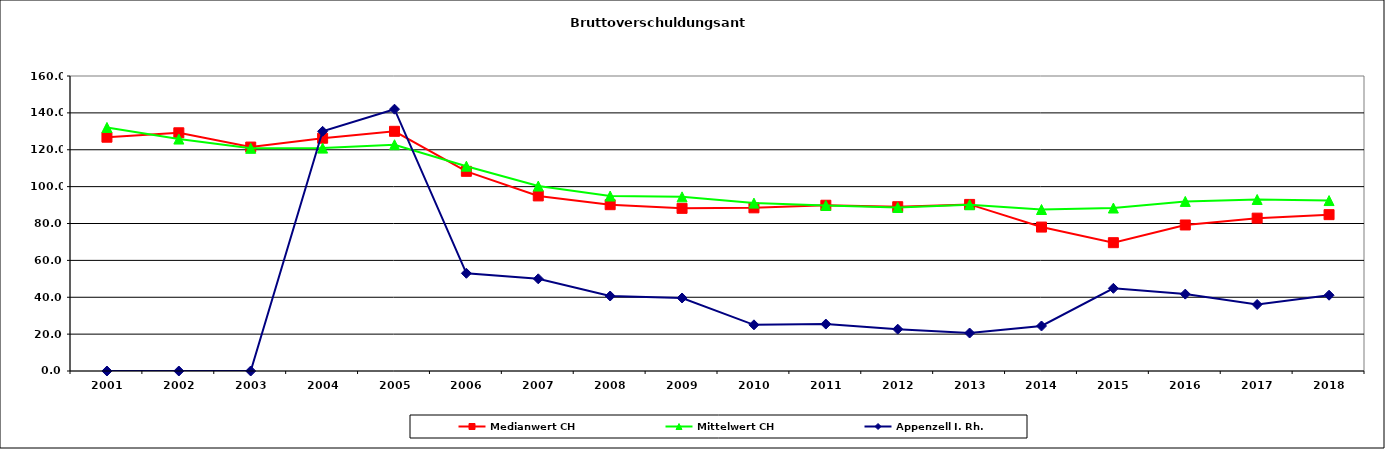
| Category | Medianwert CH | Mittelwert CH | Appenzell I. Rh. |
|---|---|---|---|
| 2001.0 | 126.8 | 132.1 | 0 |
| 2002.0 | 129.2 | 125.8 | 0 |
| 2003.0 | 121.45 | 120.775 | 0 |
| 2004.0 | 126.25 | 120.889 | 130 |
| 2005.0 | 130 | 122.728 | 142 |
| 2006.0 | 108.3 | 111.087 | 53 |
| 2007.0 | 94.96 | 100.307 | 50 |
| 2008.0 | 90.2 | 94.911 | 40.67 |
| 2009.0 | 88.22 | 94.453 | 39.6 |
| 2010.0 | 88.5 | 91.058 | 25.05 |
| 2011.0 | 89.9 | 89.805 | 25.45 |
| 2012.0 | 89.11 | 88.689 | 22.68 |
| 2013.0 | 90.35 | 90.167 | 20.6 |
| 2014.0 | 78.06 | 87.587 | 24.41 |
| 2015.0 | 69.6 | 88.398 | 44.84 |
| 2016.0 | 79.2 | 91.977 | 41.7 |
| 2017.0 | 82.9 | 93.027 | 36.06 |
| 2018.0 | 84.8 | 92.448 | 41.11 |